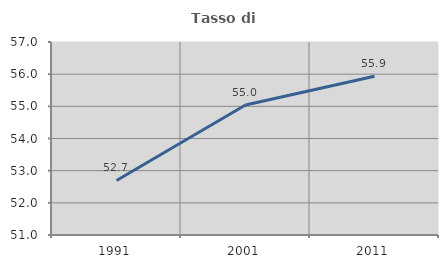
| Category | Tasso di occupazione   |
|---|---|
| 1991.0 | 52.696 |
| 2001.0 | 55.04 |
| 2011.0 | 55.934 |